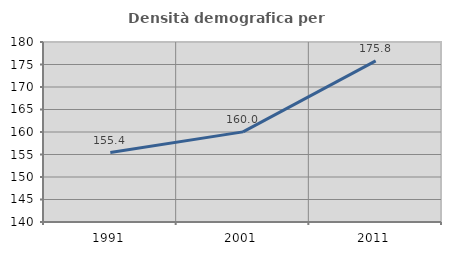
| Category | Densità demografica |
|---|---|
| 1991.0 | 155.439 |
| 2001.0 | 160.025 |
| 2011.0 | 175.796 |